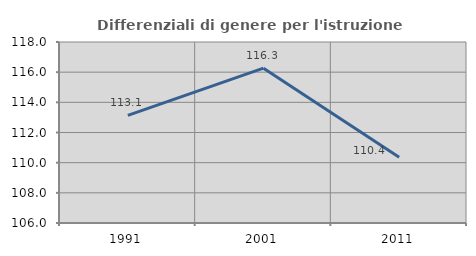
| Category | Differenziali di genere per l'istruzione superiore |
|---|---|
| 1991.0 | 113.134 |
| 2001.0 | 116.267 |
| 2011.0 | 110.36 |